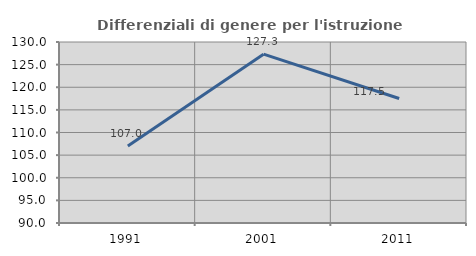
| Category | Differenziali di genere per l'istruzione superiore |
|---|---|
| 1991.0 | 107.011 |
| 2001.0 | 127.305 |
| 2011.0 | 117.516 |